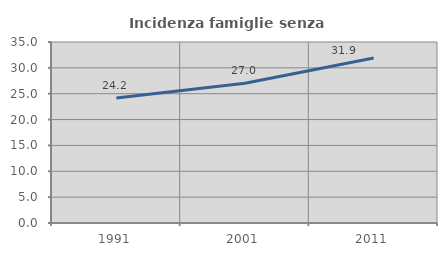
| Category | Incidenza famiglie senza nuclei |
|---|---|
| 1991.0 | 24.157 |
| 2001.0 | 27.012 |
| 2011.0 | 31.924 |